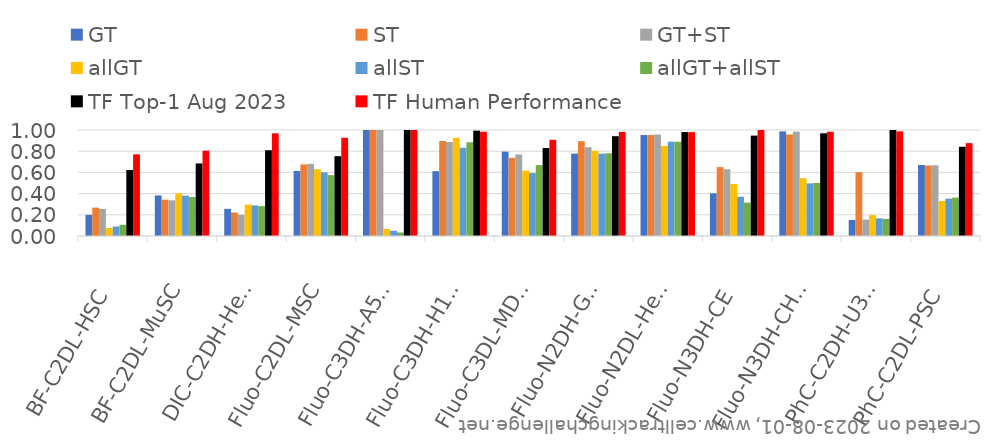
| Category | GT | ST | GT+ST | allGT | allST | allGT+allST | TF Top-1 Aug 2023 | TF Human Performance |
|---|---|---|---|---|---|---|---|---|
| BF-C2DL-HSC | 0.199 | 0.268 | 0.255 | 0.075 | 0.09 | 0.106 | 0.623 | 0.77 |
| BF-C2DL-MuSC | 0.383 | 0.343 | 0.336 | 0.403 | 0.38 | 0.368 | 0.685 | 0.805 |
| DIC-C2DH-HeLa | 0.256 | 0.221 | 0.199 | 0.296 | 0.289 | 0.282 | 0.809 | 0.969 |
| Fluo-C2DL-MSC | 0.614 | 0.674 | 0.681 | 0.63 | 0.601 | 0.574 | 0.753 | 0.927 |
| Fluo-C3DH-A549 | 1 | 1 | 1 | 0.067 | 0.05 | 0.033 | 1 | 1 |
| Fluo-C3DH-H157 | 0.611 | 0.896 | 0.886 | 0.927 | 0.832 | 0.885 | 0.994 | 0.984 |
| Fluo-C3DL-MDA231 | 0.796 | 0.738 | 0.769 | 0.616 | 0.594 | 0.669 | 0.83 | 0.908 |
| Fluo-N2DH-GOWT1 | 0.777 | 0.895 | 0.838 | 0.804 | 0.777 | 0.781 | 0.942 | 0.982 |
| Fluo-N2DL-HeLa | 0.952 | 0.953 | 0.957 | 0.85 | 0.89 | 0.889 | 0.98 | 0.98 |
| Fluo-N3DH-CE | 0.403 | 0.65 | 0.629 | 0.49 | 0.37 | 0.314 | 0.947 | 1 |
| Fluo-N3DH-CHO | 0.986 | 0.957 | 0.984 | 0.545 | 0.496 | 0.5 | 0.969 | 0.984 |
| PhC-C2DH-U373 | 0.151 | 0.602 | 0.155 | 0.197 | 0.167 | 0.161 | 1 | 0.987 |
| PhC-C2DL-PSC | 0.67 | 0.665 | 0.668 | 0.33 | 0.352 | 0.362 | 0.842 | 0.876 |